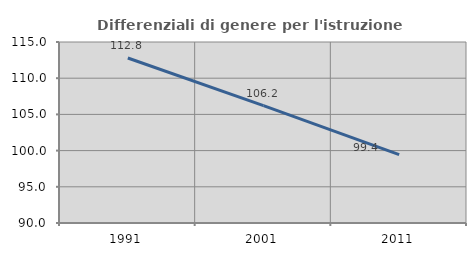
| Category | Differenziali di genere per l'istruzione superiore |
|---|---|
| 1991.0 | 112.787 |
| 2001.0 | 106.221 |
| 2011.0 | 99.434 |